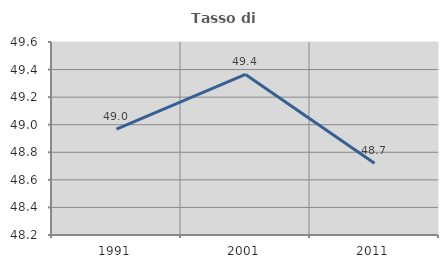
| Category | Tasso di occupazione   |
|---|---|
| 1991.0 | 48.968 |
| 2001.0 | 49.364 |
| 2011.0 | 48.72 |